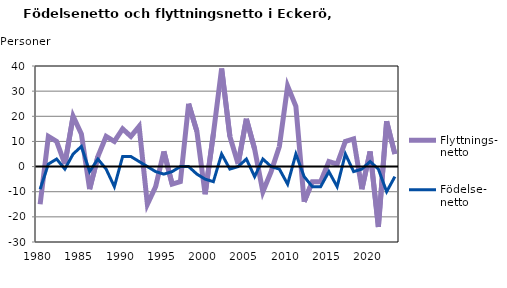
| Category | Flyttnings- netto | Födelse- netto |
|---|---|---|
| 1980.0 | -15 | -9 |
| 1981.0 | 12 | 1 |
| 1982.0 | 10 | 3 |
| 1983.0 | 1 | -1 |
| 1984.0 | 20 | 5 |
| 1985.0 | 13 | 8 |
| 1986.0 | -9 | -2 |
| 1987.0 | 4 | 3 |
| 1988.0 | 12 | -1 |
| 1989.0 | 10 | -8 |
| 1990.0 | 15 | 4 |
| 1991.0 | 12 | 4 |
| 1992.0 | 16 | 2 |
| 1993.0 | -15 | 0 |
| 1994.0 | -8 | -2 |
| 1995.0 | 6 | -3 |
| 1996.0 | -7 | -2 |
| 1997.0 | -6 | 0 |
| 1998.0 | 25 | 0 |
| 1999.0 | 14 | -3 |
| 2000.0 | -11 | -5 |
| 2001.0 | 13 | -6 |
| 2002.0 | 39 | 5 |
| 2003.0 | 12 | -1 |
| 2004.0 | 1 | 0 |
| 2005.0 | 19 | 3 |
| 2006.0 | 7 | -4 |
| 2007.0 | -10 | 3 |
| 2008.0 | -2 | 0 |
| 2009.0 | 8 | -1 |
| 2010.0 | 32 | -7 |
| 2011.0 | 24 | 5 |
| 2012.0 | -14 | -4 |
| 2013.0 | -6 | -8 |
| 2014.0 | -6 | -8 |
| 2015.0 | 2 | -2 |
| 2016.0 | 1 | -8 |
| 2017.0 | 10 | 5 |
| 2018.0 | 11 | -2 |
| 2019.0 | -9 | -1 |
| 2020.0 | 6 | 2 |
| 2021.0 | -24 | -1 |
| 2022.0 | 18 | -10 |
| 2023.0 | 5 | -4 |